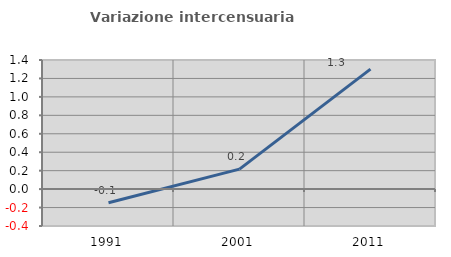
| Category | Variazione intercensuaria annua |
|---|---|
| 1991.0 | -0.148 |
| 2001.0 | 0.216 |
| 2011.0 | 1.301 |